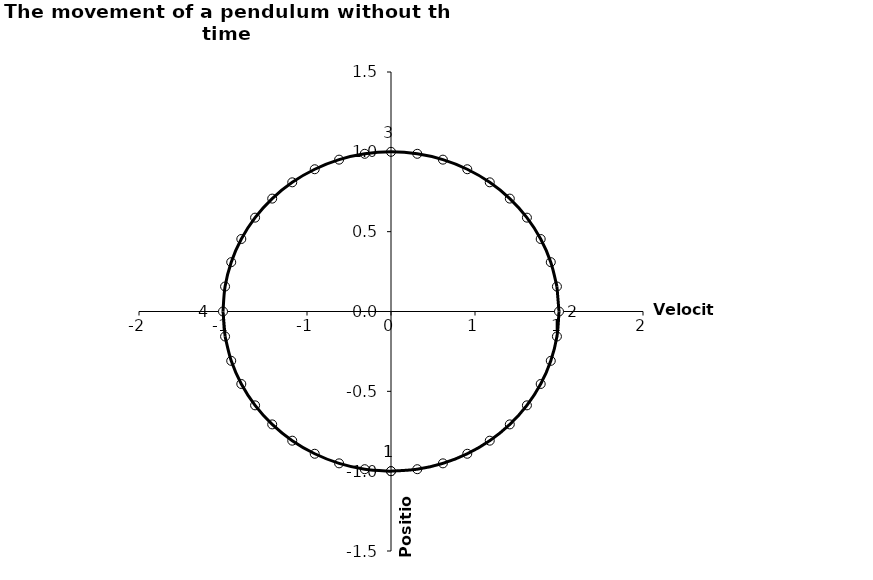
| Category | Position |
|---|---|
| 0.0 | -1 |
| 0.1564344650402311 | -0.988 |
| 0.3090169943749474 | -0.951 |
| 0.45399049973954675 | -0.891 |
| 0.5877852522924731 | -0.809 |
| 0.7071067811865475 | -0.707 |
| 0.8090169943749475 | -0.588 |
| 0.8910065241883678 | -0.454 |
| 0.9510565162951535 | -0.309 |
| 0.9876883405951378 | -0.156 |
| 1.0 | 0 |
| 0.9876883405951378 | 0.156 |
| 0.9510565162951534 | 0.309 |
| 0.8910065241883681 | 0.454 |
| 0.8090169943749475 | 0.588 |
| 0.7071067811865476 | 0.707 |
| 0.5877852522924732 | 0.809 |
| 0.45399049973954686 | 0.891 |
| 0.3090169943749475 | 0.951 |
| 0.15643446504023098 | 0.988 |
| 1.22514845490862e-16 | 1 |
| -0.15643446504023073 | 0.988 |
| -0.3090169943749473 | 0.951 |
| -0.4539904997395467 | 0.891 |
| -0.587785252292473 | 0.809 |
| -0.7071067811865475 | 0.707 |
| -0.8090169943749473 | 0.588 |
| -0.8910065241883678 | 0.454 |
| -0.9510565162951535 | 0.309 |
| -0.9876883405951377 | 0.156 |
| -1.0 | 0 |
| -0.9876883405951379 | -0.156 |
| -0.9510565162951536 | -0.309 |
| -0.8910065241883679 | -0.454 |
| -0.809016994374947 | -0.588 |
| -0.7071067811865477 | -0.707 |
| -0.587785252292474 | -0.809 |
| -0.45399049973956046 | -0.891 |
| -0.30901699437496283 | -0.951 |
| -0.15643446504024688 | -0.988 |
| -1.5344062825883853e-14 | -1 |